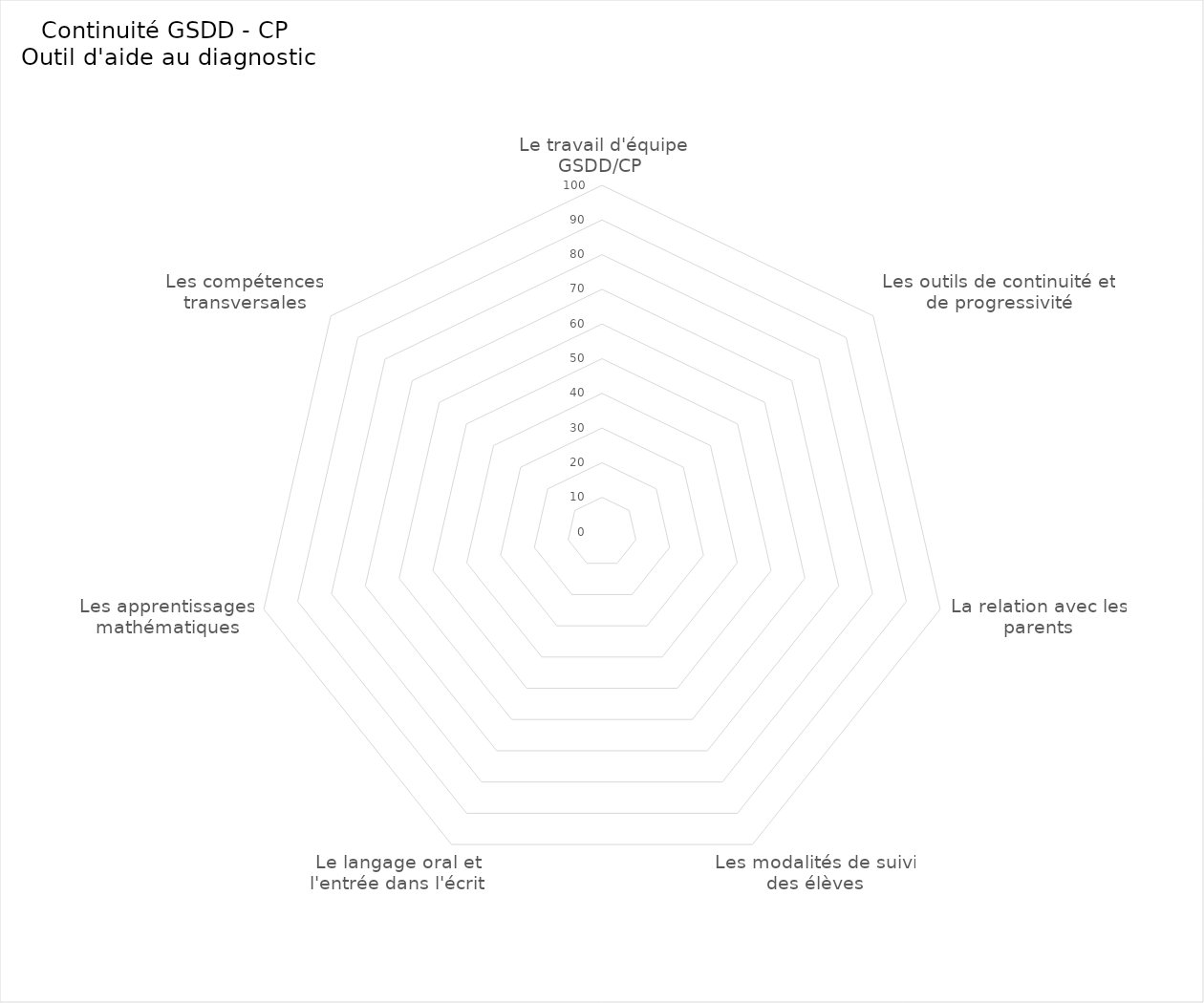
| Category | Series 0 |
|---|---|
| Le travail d'équipe GSDD/CP  | 0 |
| Les outils de continuité et de progressivité | 0 |
| La relation avec les parents | 0 |
| Les modalités de suivi des élèves | 0 |
| Le langage oral et l'entrée dans l'écrit | 0 |
| Les apprentissages mathématiques | 0 |
| Les compétences transversales | 0 |